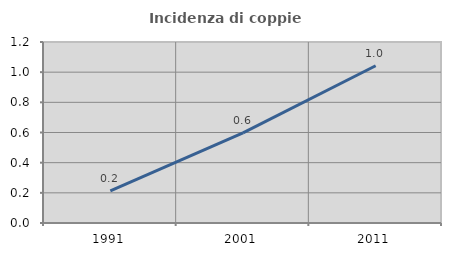
| Category | Incidenza di coppie miste |
|---|---|
| 1991.0 | 0.214 |
| 2001.0 | 0.598 |
| 2011.0 | 1.042 |